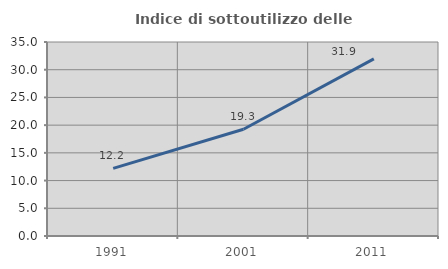
| Category | Indice di sottoutilizzo delle abitazioni  |
|---|---|
| 1991.0 | 12.207 |
| 2001.0 | 19.266 |
| 2011.0 | 31.944 |